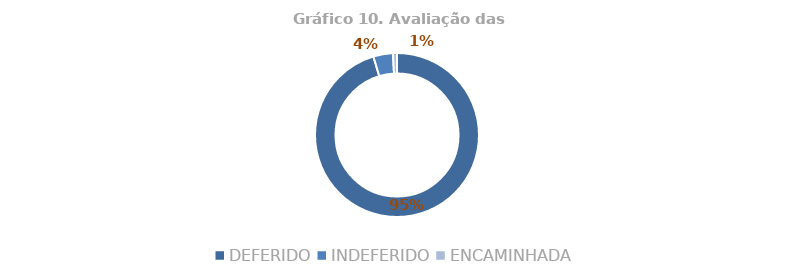
| Category | Total |
|---|---|
| DEFERIDO | 0.953 |
| INDEFERIDO | 0.039 |
| ENCAMINHADA | 0.008 |